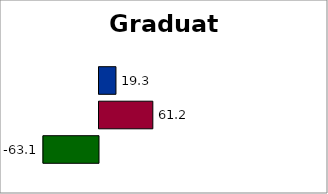
| Category | Series 2 | SREB states | 50 states and D.C. |
|---|---|---|---|
| 0 | -63.089 | 61.18 | 19.268 |